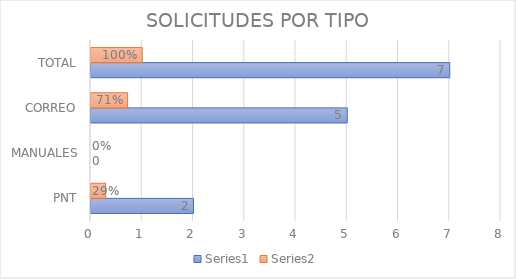
| Category | Series 0 | Series 1 |
|---|---|---|
| PNT | 2 | 0.286 |
| MANUALES | 0 | 0 |
| CORREO | 5 | 0.714 |
| TOTAL | 7 | 1 |